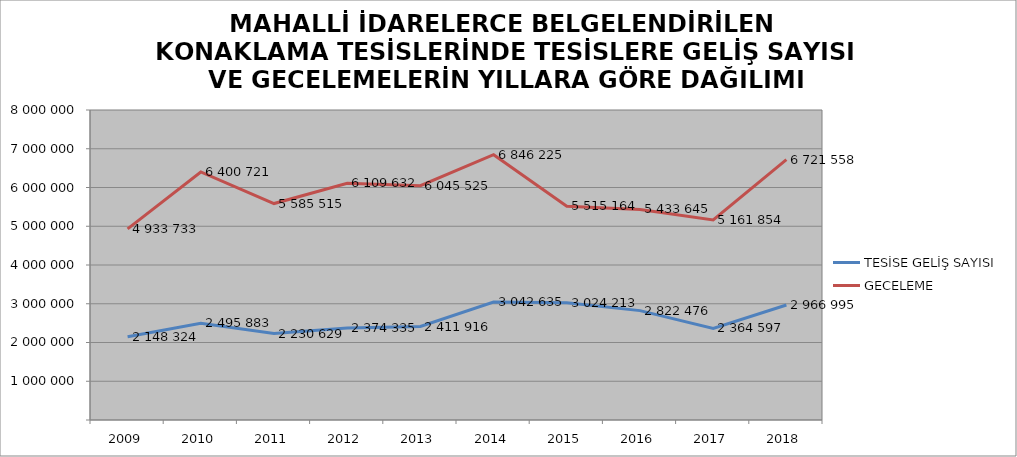
| Category | TESİSE GELİŞ SAYISI | GECELEME |
|---|---|---|
| 2009 | 2148324 | 4933733 |
| 2010 | 2495883 | 6400721 |
| 2011 | 2230629 | 5585515 |
| 2012 | 2374335 | 6109632 |
| 2013 | 2411916 | 6045525 |
| 2014 | 3042635 | 6846225 |
| 2015 | 3024213 | 5515164 |
| 2016 | 2822476 | 5433645 |
| 2017 | 2364597 | 5161854 |
| 2018 | 2966995 | 6721558 |